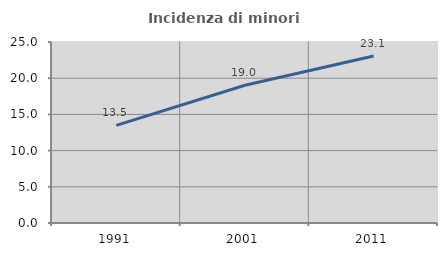
| Category | Incidenza di minori stranieri |
|---|---|
| 1991.0 | 13.475 |
| 2001.0 | 19.02 |
| 2011.0 | 23.054 |